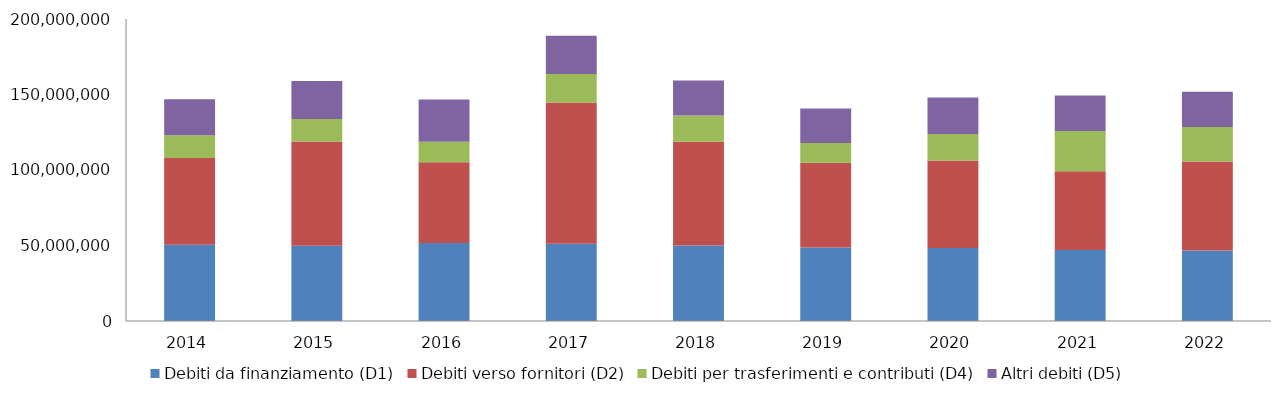
| Category | Debiti da finanziamento (D1) | Debiti verso fornitori (D2) | Debiti per trasferimenti e contributi (D4) | Altri debiti (D5) |
|---|---|---|---|---|
| 2014.0 | 50501178.03 | 57367958.39 | 15191267.92 | 23875176.37 |
| 2015.0 | 49838514.63 | 68970974.7 | 14905583.08 | 25258433.57 |
| 2016.0 | 51710507.85 | 53380785.84 | 13631912.71 | 28023531.07 |
| 2017.0 | 51138586.94 | 93584029.83 | 18790447.29 | 25430439.77 |
| 2018.0 | 49939350.42 | 68851900.4 | 17231104.71 | 23231668.26 |
| 2019.0 | 48612500.46 | 56168556.24 | 13022370.89 | 22941756.07 |
| 2020.0 | 48332153.27 | 58022498.86 | 17423059.17 | 24194973.78 |
| 2021.0 | 47089668.53 | 52106106.27 | 26618963.57 | 23466550.58 |
| 2022.0 | 46768434.04 | 58919970.63 | 22770360.61 | 23397533.09 |